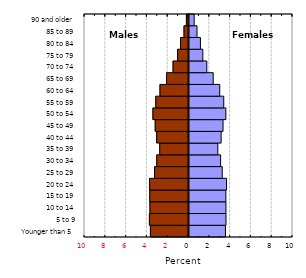
| Category | Female |
|---|---|
| Younger than 5 | 3.503 |
| 5 to 9 | 3.558 |
| 10 to 14 | 3.552 |
| 15 to 19 | 3.545 |
| 20 to 24 | 3.61 |
| 25 to 29 | 3.197 |
| 30 to 34 | 3.038 |
| 35 to 39 | 2.771 |
| 40 to 44 | 3.088 |
| 45 to 49 | 3.274 |
| 50 to 54 | 3.544 |
| 55 to 59 | 3.342 |
| 60 to 64 | 2.955 |
| 65 to 69 | 2.328 |
| 70 to 74 | 1.712 |
| 75 to 79 | 1.331 |
| 80 to 84 | 1.099 |
| 85 to 89 | 0.768 |
| 90 and older | 0.498 |